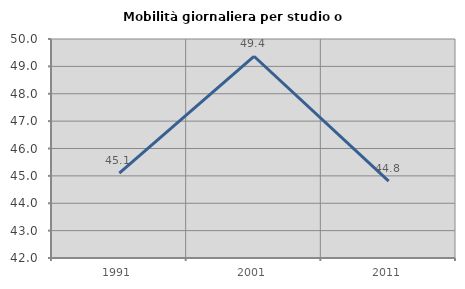
| Category | Mobilità giornaliera per studio o lavoro |
|---|---|
| 1991.0 | 45.104 |
| 2001.0 | 49.369 |
| 2011.0 | 44.808 |